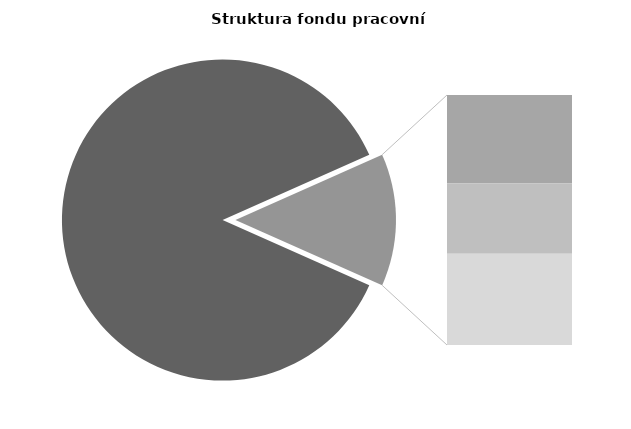
| Category | Series 0 |
|---|---|
| Průměrná měsíční 
odpracovaná doba  
bez přesčasu | 148.809 |
| Dovolená | 8.068 |
| Nemoc | 6.466 |
| Jiné | 8.351 |